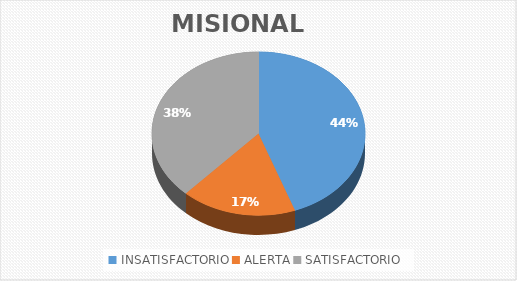
| Category | MISIONAL | ESTRATÉGICO |
|---|---|---|
| INSATISFACTORIO | 28 | 3 |
| ALERTA | 11 | 1 |
| SATISFACTORIO | 24 | 10 |